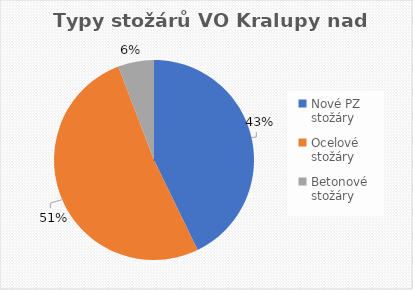
| Category | Typy stožárů VO Kralupy nad Vltavou |
|---|---|
| Nové PZ stožáry | 995 |
| Ocelové stožáry | 1194 |
| Betonové stožáry | 135 |